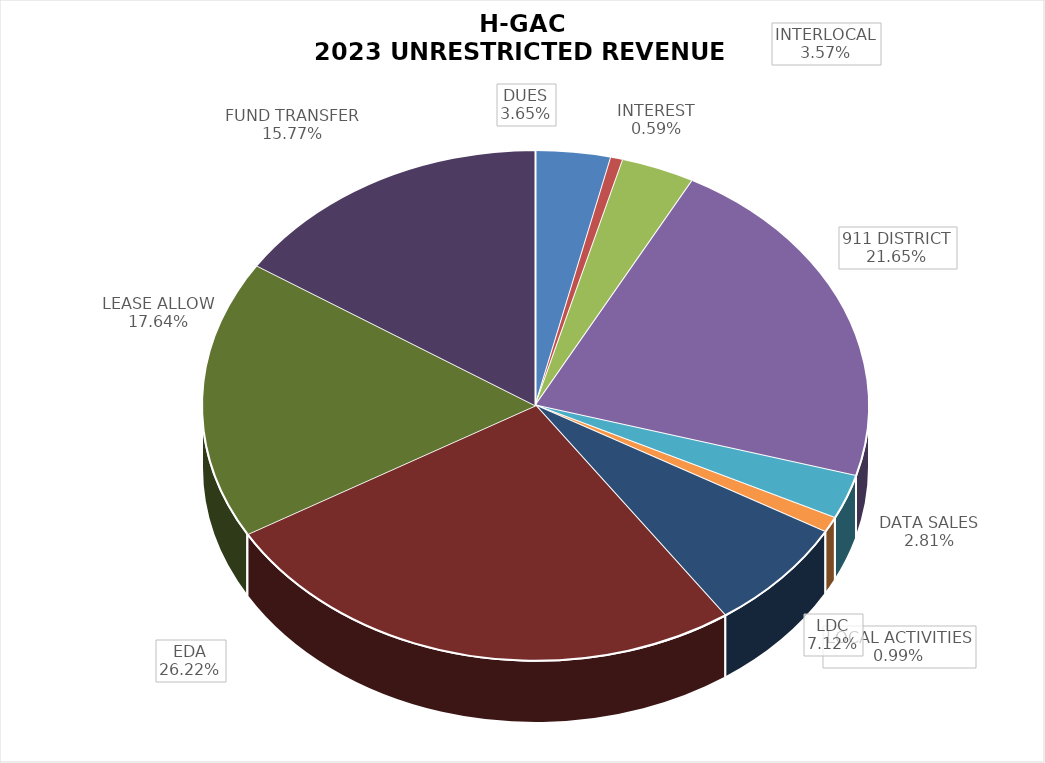
| Category | Series 0 |
|---|---|
| DUES | 0.036 |
| INTEREST | 0.006 |
| INTERLOCAL | 0.036 |
| 911 DISTRICT | 0.216 |
| DATA SALES | 0.028 |
| LOCAL ACTIVITIES | 0.01 |
| LDC | 0.071 |
| EDA | 0.262 |
| LEASE ALLOW | 0.176 |
| FUND TRANSFER | 0.158 |